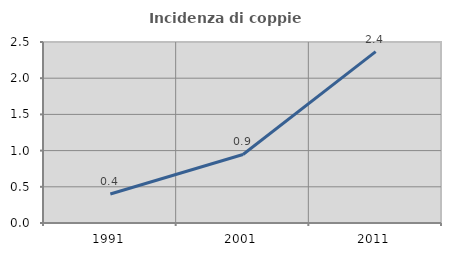
| Category | Incidenza di coppie miste |
|---|---|
| 1991.0 | 0.4 |
| 2001.0 | 0.946 |
| 2011.0 | 2.367 |